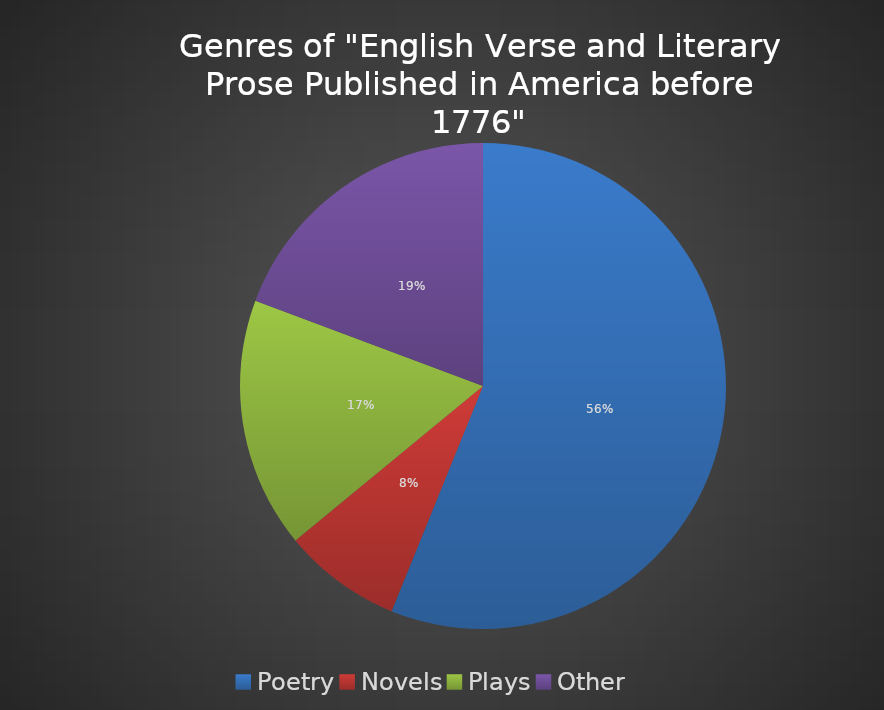
| Category | Series 0 |
|---|---|
| Poetry | 64 |
| Novels | 9 |
| Plays | 19 |
| Other | 22 |